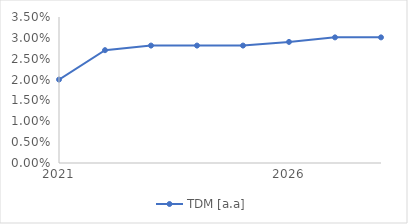
| Category | TDM [a.a] |
|---|---|
| 2021.0 | 0.02 |
| 2022.0 | 0.027 |
| 2023.0 | 0.028 |
| 2024.0 | 0.028 |
| 2025.0 | 0.028 |
| 2026.0 | 0.029 |
| 2027.0 | 0.03 |
| 2028.0 | 0.03 |